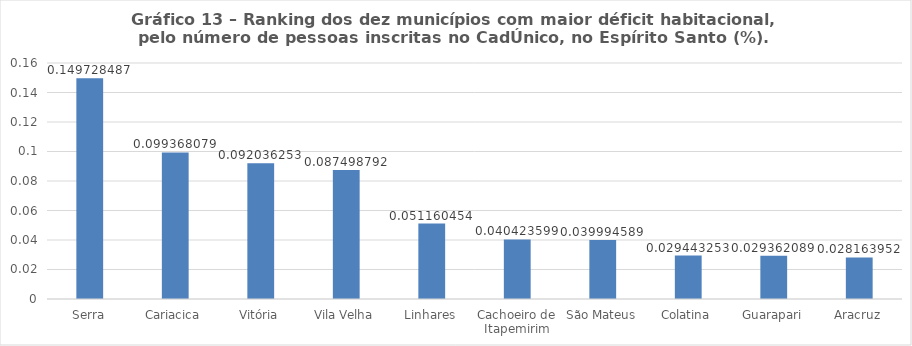
| Category | Series 0 |
|---|---|
| Serra | 0.15 |
| Cariacica | 0.099 |
| Vitória | 0.092 |
| Vila Velha | 0.087 |
| Linhares | 0.051 |
| Cachoeiro de Itapemirim | 0.04 |
| São Mateus | 0.04 |
| Colatina | 0.029 |
| Guarapari | 0.029 |
| Aracruz | 0.028 |